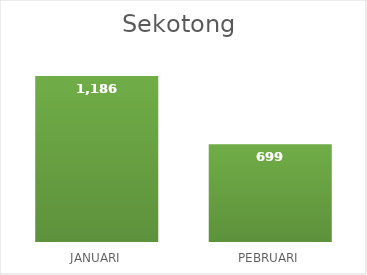
| Category | Series 0 |
|---|---|
| JANUARI | 1186 |
| PEBRUARI | 699 |